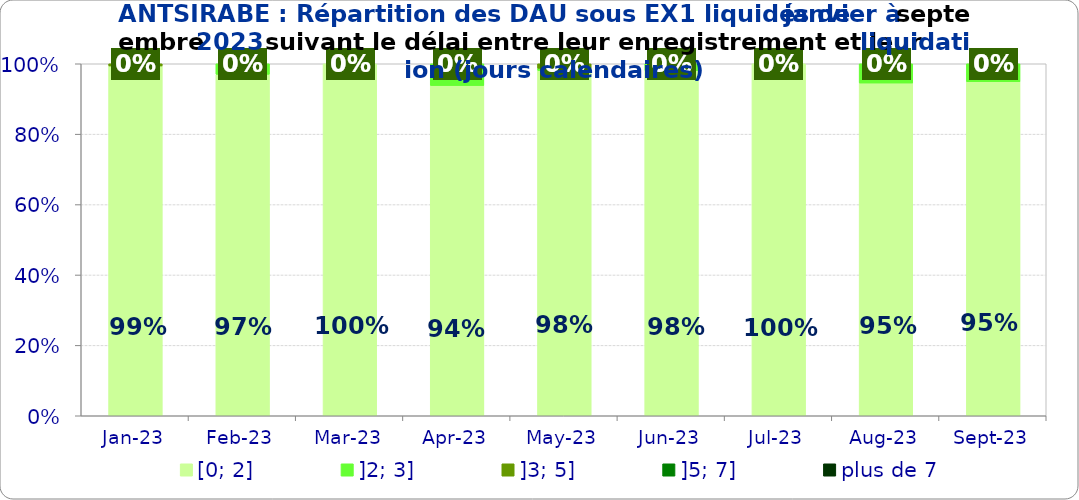
| Category | [0; 2] | ]2; 3] | ]3; 5] | ]5; 7] | plus de 7 |
|---|---|---|---|---|---|
| 2023-01-01 | 0.994 | 0 | 0.006 | 0 | 0 |
| 2023-02-01 | 0.97 | 0.03 | 0 | 0 | 0 |
| 2023-03-01 | 1 | 0 | 0 | 0 | 0 |
| 2023-04-01 | 0.938 | 0.062 | 0 | 0 | 0 |
| 2023-05-01 | 0.981 | 0.006 | 0.013 | 0 | 0 |
| 2023-06-01 | 0.98 | 0.02 | 0 | 0 | 0 |
| 2023-07-01 | 1 | 0 | 0 | 0 | 0 |
| 2023-08-01 | 0.945 | 0.055 | 0 | 0 | 0 |
| 2023-09-01 | 0.949 | 0.051 | 0 | 0 | 0 |